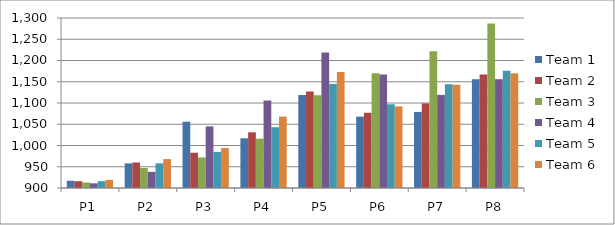
| Category | Team 1 | Team 2 | Team 3 | Team 4 | Team 5 | Team 6 |
|---|---|---|---|---|---|---|
| P1 | 917 | 916 | 913 | 911 | 916 | 919 |
| P2 | 958 | 960 | 947 | 938 | 958 | 968 |
| P3 | 1056 | 983 | 972 | 1045 | 985 | 994 |
| P4 | 1017 | 1031 | 1016 | 1106 | 1043 | 1068 |
| P5 | 1119 | 1127 | 1118 | 1219 | 1145 | 1173 |
| P6 | 1068 | 1077 | 1170 | 1167 | 1097 | 1092 |
| P7 | 1079 | 1099 | 1222 | 1119 | 1144 | 1143 |
| P8 | 1156 | 1167 | 1287 | 1156 | 1176 | 1170 |